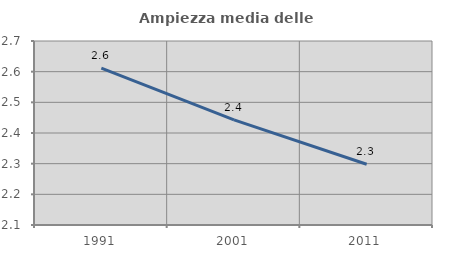
| Category | Ampiezza media delle famiglie |
|---|---|
| 1991.0 | 2.612 |
| 2001.0 | 2.443 |
| 2011.0 | 2.298 |